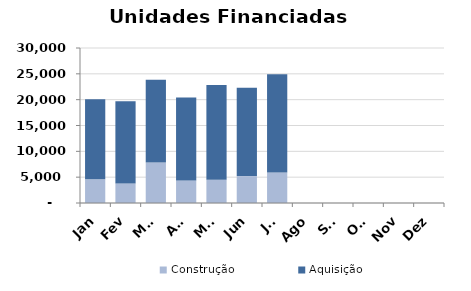
| Category | Construção | Aquisição  |
|---|---|---|
| Jan | 4588 | 15500 |
| Fev | 3778 | 15917 |
| Mar | 7819 | 16035 |
| Abr | 4377 | 16062 |
| Mai | 4499 | 18329 |
| Jun | 5207 | 17091 |
| Jul | 5904 | 19009 |
| Ago | 0 | 0 |
| Set | 0 | 0 |
| Out | 0 | 0 |
| Nov | 0 | 0 |
| Dez | 0 | 0 |